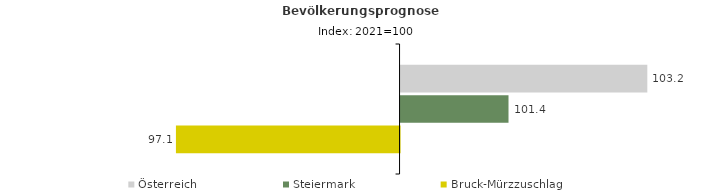
| Category | Österreich | Steiermark | Bruck-Mürzzuschlag |
|---|---|---|---|
| 2021.0 | 103.2 | 101.4 | 97.1 |